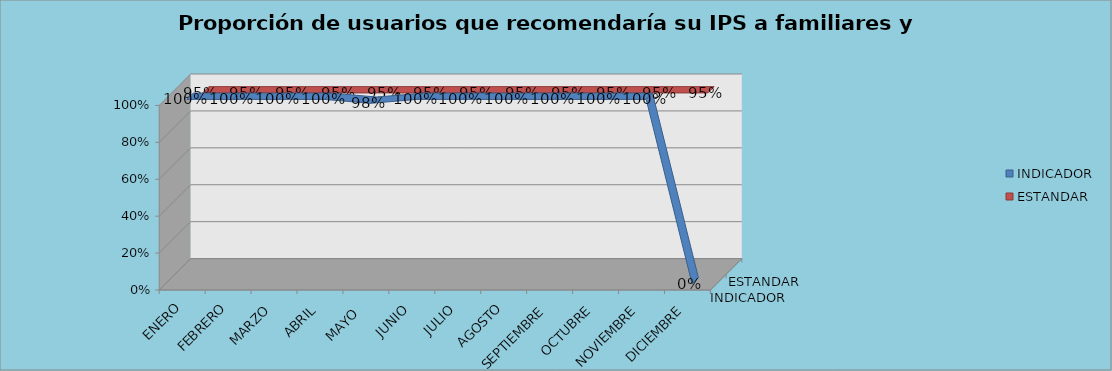
| Category | INDICADOR | ESTANDAR |
|---|---|---|
| ENERO | 1 | 0.95 |
| FEBRERO | 1 | 0.95 |
| MARZO | 1 | 0.95 |
| ABRIL | 1 | 0.95 |
| MAYO  | 0.979 | 0.95 |
| JUNIO | 1 | 0.95 |
| JULIO | 1 | 0.95 |
| AGOSTO | 1 | 0.95 |
| SEPTIEMBRE | 1 | 0.95 |
| OCTUBRE | 1 | 0.95 |
| NOVIEMBRE | 1 | 0.95 |
| DICIEMBRE | 0 | 0.95 |